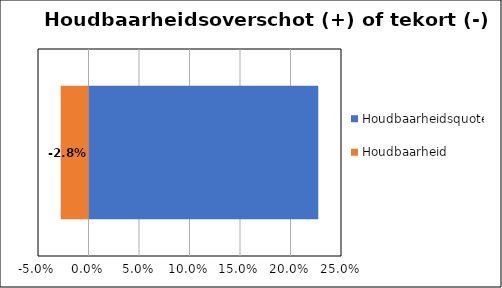
| Category | Houdbaarheidsquote | Houdbaarheid |
|---|---|---|
| Netto schuldquote ultimo 2020 | 0.227 | -0.027 |